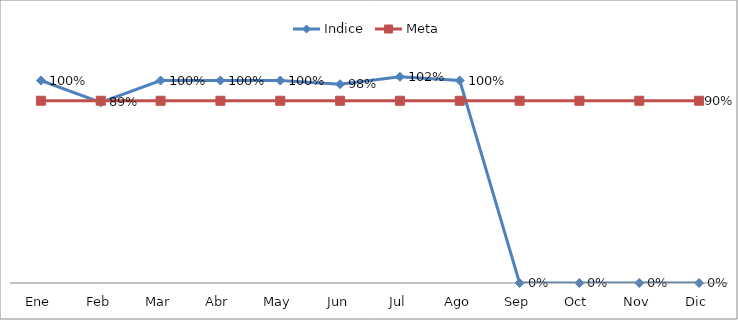
| Category | Indice | Meta |
|---|---|---|
| Ene | 1 | 0.9 |
| Feb | 0.892 | 0.9 |
| Mar | 1 | 0.9 |
| Abr | 1 | 0.9 |
| May | 1 | 0.9 |
| Jun | 0.982 | 0.9 |
| Jul | 1.018 | 0.9 |
| Ago | 1 | 0.9 |
| Sep | 0 | 0.9 |
| Oct | 0 | 0.9 |
| Nov | 0 | 0.9 |
| Dic | 0 | 0.9 |